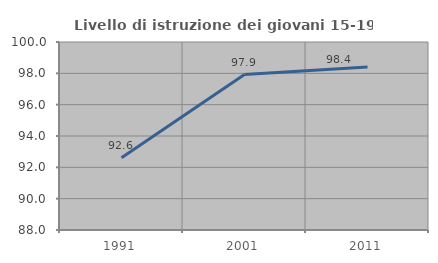
| Category | Livello di istruzione dei giovani 15-19 anni |
|---|---|
| 1991.0 | 92.618 |
| 2001.0 | 97.922 |
| 2011.0 | 98.409 |